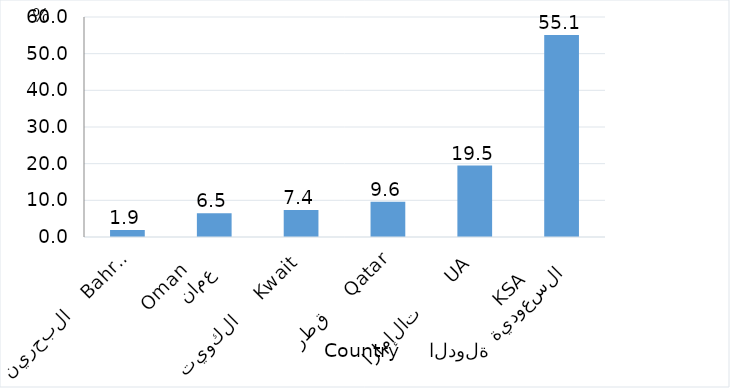
| Category | Series 0 |
|---|---|
| السعودية
KSA      | 55.111 |
| الإمارات       UAE | 19.495 |
|     قطر     Qatar | 9.627 |
| الكويت     Kwait | 7.391 |
| عمان
 Oman    | 6.458 |
| البحرين    Bahrain | 1.919 |